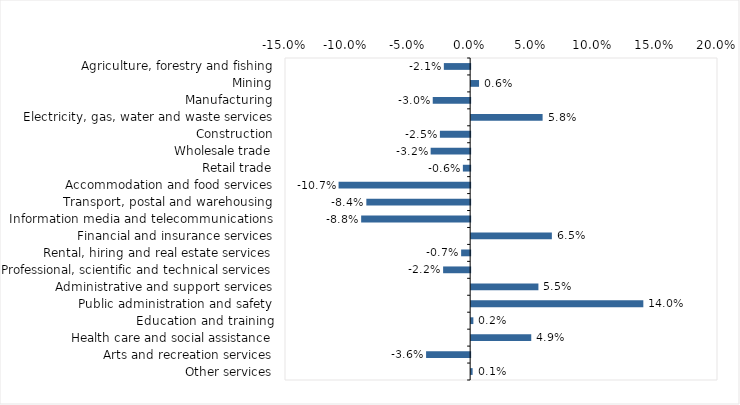
| Category | This week |
|---|---|
| Agriculture, forestry and fishing | -0.021 |
| Mining | 0.006 |
| Manufacturing | -0.03 |
| Electricity, gas, water and waste services | 0.058 |
| Construction | -0.024 |
| Wholesale trade | -0.032 |
| Retail trade | -0.006 |
| Accommodation and food services | -0.107 |
| Transport, postal and warehousing | -0.084 |
| Information media and telecommunications | -0.088 |
| Financial and insurance services | 0.065 |
| Rental, hiring and real estate services | -0.007 |
| Professional, scientific and technical services | -0.022 |
| Administrative and support services | 0.054 |
| Public administration and safety | 0.14 |
| Education and training | 0.002 |
| Health care and social assistance | 0.049 |
| Arts and recreation services | -0.036 |
| Other services | 0.001 |